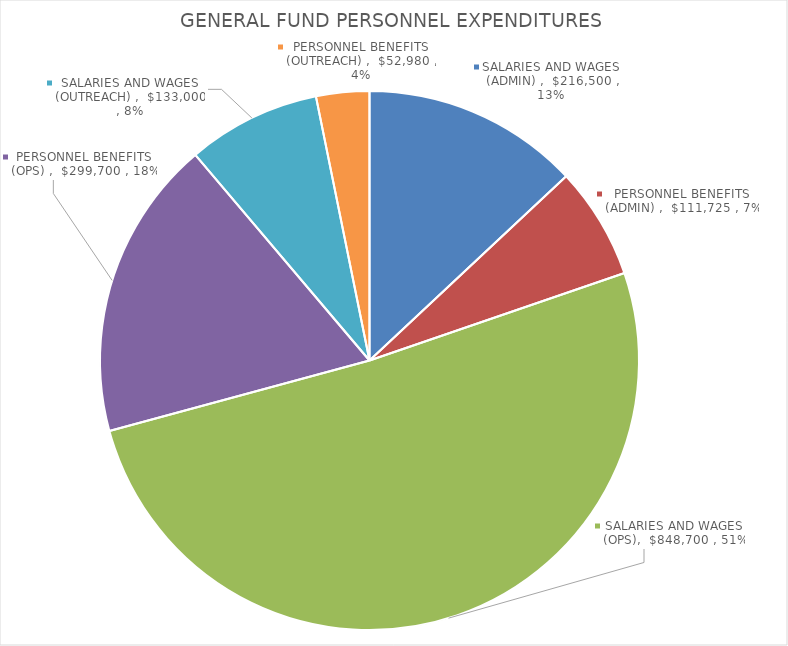
| Category | Series 0 |
|---|---|
| SALARIES AND WAGES (ADMIN)  | 216500 |
| PERSONNEL BENEFITS (ADMIN)  | 111725 |
| SALARIES AND WAGES (OPS) | 848700 |
| PERSONNEL BENEFITS (OPS)  | 299700 |
| SALARIES AND WAGES (OUTREACH)  | 133000 |
| PERSONNEL BENEFITS (OUTREACH)  | 52980 |